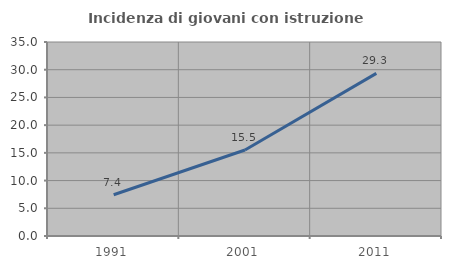
| Category | Incidenza di giovani con istruzione universitaria |
|---|---|
| 1991.0 | 7.448 |
| 2001.0 | 15.509 |
| 2011.0 | 29.332 |